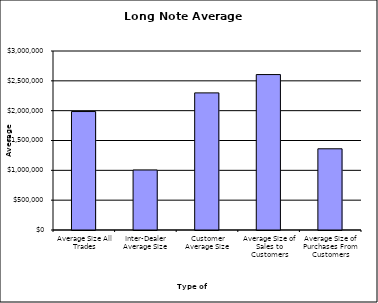
| Category | Security Type |
|---|---|
| Average Size All Trades | 1985403.462 |
| Inter-Dealer Average Size | 1005708.375 |
| Customer Average Size | 2297996.416 |
| Average Size of Sales to Customers | 2604945.042 |
| Average Size of Purchases From Customers | 1361047.025 |